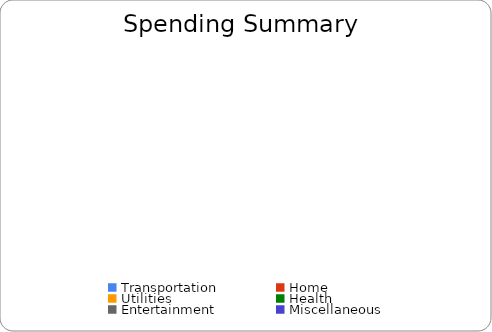
| Category | Series 0 |
|---|---|
| Transportation | 0 |
| Home | 0 |
| Utilities | 0 |
| Health | 0 |
| Entertainment | 0 |
| Miscellaneous | 0 |